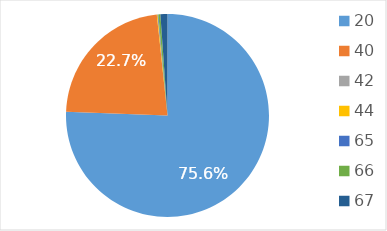
| Category | Доля, % |
|---|---|
| 20.0 | 0.756 |
| 40.0 | 0.227 |
| 42.0 | 0 |
| 44.0 | 0.001 |
| 65.0 | 0.001 |
| 66.0 | 0.003 |
| 67.0 | 0.011 |